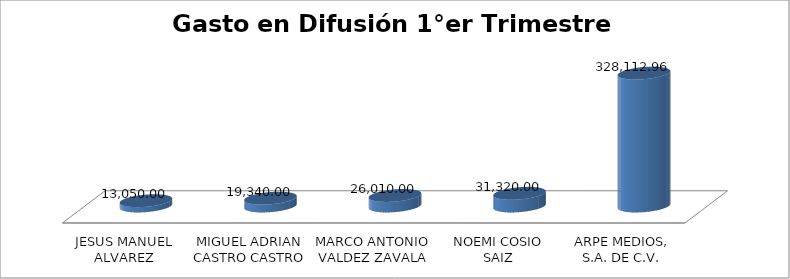
| Category | Suma |
|---|---|
| JESUS MANUEL ALVAREZ PALAFOX | 13050 |
| MIGUEL ADRIAN CASTRO CASTRO | 19340 |
| MARCO ANTONIO VALDEZ ZAVALA | 26010 |
| NOEMI COSIO SAIZ | 31320 |
| ARPE MEDIOS, S.A. DE C.V. | 328112.96 |